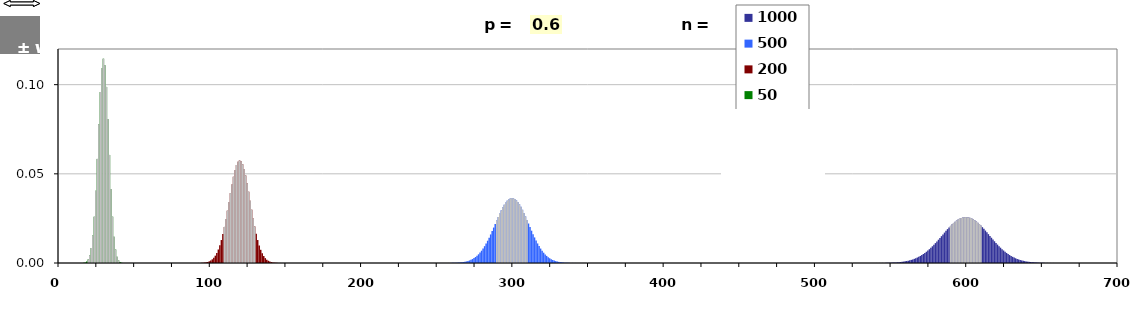
| Category | 1000 | 500 | 200 | 50 |
|---|---|---|---|---|
| 0.0 | -1 | -1 | -1 | -1 |
| 1.0 | -1 | -1 | -1 | -1 |
| 2.0 | -1 | -1 | -1 | -1 |
| 3.0 | -1 | -1 | -1 | -1 |
| 4.0 | -1 | -1 | -1 | -1 |
| 5.0 | -1 | -1 | -1 | -1 |
| 6.0 | -1 | -1 | -1 | -1 |
| 7.0 | -1 | -1 | -1 | -1 |
| 8.0 | -1 | -1 | -1 | -1 |
| 9.0 | -1 | -1 | -1 | -1 |
| 10.0 | -1 | -1 | -1 | -1 |
| 11.0 | -1 | -1 | -1 | -1 |
| 12.0 | -1 | -1 | -1 | -1 |
| 13.0 | -1 | -1 | -1 | -1 |
| 14.0 | -1 | -1 | -1 | -1 |
| 15.0 | -1 | -1 | -1 | -1 |
| 16.0 | -1 | -1 | -1 | -1 |
| 17.0 | -1 | -1 | -1 | -1 |
| 18.0 | -1 | -1 | -1 | -1 |
| 19.0 | -1 | -1 | -1 | -1 |
| 20.0 | -1 | -1 | -1 | 0.002 |
| 21.0 | -1 | -1 | -1 | 0.004 |
| 22.0 | -1 | -1 | -1 | 0.008 |
| 23.0 | -1 | -1 | -1 | 0.015 |
| 24.0 | -1 | -1 | -1 | 0.026 |
| 25.0 | -1 | -1 | -1 | 0.04 |
| 26.0 | -1 | -1 | -1 | 0.058 |
| 27.0 | -1 | -1 | -1 | 0.078 |
| 28.0 | -1 | -1 | -1 | 0.096 |
| 29.0 | -1 | -1 | -1 | 0.109 |
| 30.0 | -1 | -1 | -1 | 0.115 |
| 31.0 | -1 | -1 | -1 | 0.111 |
| 32.0 | -1 | -1 | -1 | 0.099 |
| 33.0 | -1 | -1 | -1 | 0.081 |
| 34.0 | -1 | -1 | -1 | 0.061 |
| 35.0 | -1 | -1 | -1 | 0.042 |
| 36.0 | -1 | -1 | -1 | 0.026 |
| 37.0 | -1 | -1 | -1 | 0.015 |
| 38.0 | -1 | -1 | -1 | 0.008 |
| 39.0 | -1 | -1 | -1 | 0.003 |
| 40.0 | -1 | -1 | -1 | 0.001 |
| 41.0 | -1 | -1 | -1 | -1 |
| 42.0 | -1 | -1 | -1 | -1 |
| 43.0 | -1 | -1 | -1 | -1 |
| 44.0 | -1 | -1 | -1 | -1 |
| 45.0 | -1 | -1 | -1 | -1 |
| 46.0 | -1 | -1 | -1 | -1 |
| 47.0 | -1 | -1 | -1 | -1 |
| 48.0 | -1 | -1 | -1 | -1 |
| 49.0 | -1 | -1 | -1 | -1 |
| 50.0 | -1 | -1 | -1 | -1 |
| 51.0 | -1 | -1 | -1 | -1 |
| 52.0 | -1 | -1 | -1 | -1 |
| 53.0 | -1 | -1 | -1 | -1 |
| 54.0 | -1 | -1 | -1 | -1 |
| 55.0 | -1 | -1 | -1 | -1 |
| 56.0 | -1 | -1 | -1 | -1 |
| 57.0 | -1 | -1 | -1 | -1 |
| 58.0 | -1 | -1 | -1 | -1 |
| 59.0 | -1 | -1 | -1 | -1 |
| 60.0 | -1 | -1 | -1 | -1 |
| 61.0 | -1 | -1 | -1 | -1 |
| 62.0 | -1 | -1 | -1 | -1 |
| 63.0 | -1 | -1 | -1 | -1 |
| 64.0 | -1 | -1 | -1 | -1 |
| 65.0 | -1 | -1 | -1 | -1 |
| 66.0 | -1 | -1 | -1 | -1 |
| 67.0 | -1 | -1 | -1 | -1 |
| 68.0 | -1 | -1 | -1 | -1 |
| 69.0 | -1 | -1 | -1 | -1 |
| 70.0 | -1 | -1 | -1 | -1 |
| 71.0 | -1 | -1 | -1 | -1 |
| 72.0 | -1 | -1 | -1 | -1 |
| 73.0 | -1 | -1 | -1 | -1 |
| 74.0 | -1 | -1 | -1 | -1 |
| 75.0 | -1 | -1 | -1 | -1 |
| 76.0 | -1 | -1 | -1 | -1 |
| 77.0 | -1 | -1 | -1 | -1 |
| 78.0 | -1 | -1 | -1 | -1 |
| 79.0 | -1 | -1 | -1 | -1 |
| 80.0 | -1 | -1 | -1 | -1 |
| 81.0 | -1 | -1 | -1 | -1 |
| 82.0 | -1 | -1 | -1 | -1 |
| 83.0 | -1 | -1 | -1 | -1 |
| 84.0 | -1 | -1 | -1 | -1 |
| 85.0 | -1 | -1 | -1 | -1 |
| 86.0 | -1 | -1 | -1 | -1 |
| 87.0 | -1 | -1 | -1 | -1 |
| 88.0 | -1 | -1 | -1 | -1 |
| 89.0 | -1 | -1 | -1 | -1 |
| 90.0 | -1 | -1 | -1 | -1 |
| 91.0 | -1 | -1 | -1 | -1 |
| 92.0 | -1 | -1 | -1 | -1 |
| 93.0 | -1 | -1 | -1 | -1 |
| 94.0 | -1 | -1 | -1 | -1 |
| 95.0 | -1 | -1 | -1 | -1 |
| 96.0 | -1 | -1 | -1 | -1 |
| 97.0 | -1 | -1 | -1 | -1 |
| 98.0 | -1 | -1 | -1 | -1 |
| 99.0 | -1 | -1 | -1 | -1 |
| 100.0 | -1 | -1 | -1 | -1 |
| 101.0 | -1 | -1 | -1 | -1 |
| 102.0 | -1 | -1 | -1 | -1 |
| 103.0 | -1 | -1 | -1 | -1 |
| 104.0 | -1 | -1 | -1 | -1 |
| 105.0 | -1 | -1 | -1 | -1 |
| 106.0 | -1 | -1 | -1 | -1 |
| 107.0 | -1 | -1 | -1 | -1 |
| 108.0 | -1 | -1 | -1 | -1 |
| 109.0 | -1 | -1 | -1 | -1 |
| 110.0 | -1 | -1 | 0.02 | -1 |
| 111.0 | -1 | -1 | 0.025 | -1 |
| 112.0 | -1 | -1 | 0.029 | -1 |
| 113.0 | -1 | -1 | 0.034 | -1 |
| 114.0 | -1 | -1 | 0.039 | -1 |
| 115.0 | -1 | -1 | 0.044 | -1 |
| 116.0 | -1 | -1 | 0.048 | -1 |
| 117.0 | -1 | -1 | 0.052 | -1 |
| 118.0 | -1 | -1 | 0.055 | -1 |
| 119.0 | -1 | -1 | 0.057 | -1 |
| 120.0 | -1 | -1 | 0.058 | -1 |
| 121.0 | -1 | -1 | 0.057 | -1 |
| 122.0 | -1 | -1 | 0.055 | -1 |
| 123.0 | -1 | -1 | 0.053 | -1 |
| 124.0 | -1 | -1 | 0.049 | -1 |
| 125.0 | -1 | -1 | 0.045 | -1 |
| 126.0 | -1 | -1 | 0.04 | -1 |
| 127.0 | -1 | -1 | 0.035 | -1 |
| 128.0 | -1 | -1 | 0.03 | -1 |
| 129.0 | -1 | -1 | 0.025 | -1 |
| 130.0 | -1 | -1 | 0.02 | -1 |
| 131.0 | -1 | -1 | -1 | -1 |
| 132.0 | -1 | -1 | -1 | -1 |
| 133.0 | -1 | -1 | -1 | -1 |
| 134.0 | -1 | -1 | -1 | -1 |
| 135.0 | -1 | -1 | -1 | -1 |
| 136.0 | -1 | -1 | -1 | -1 |
| 137.0 | -1 | -1 | -1 | -1 |
| 138.0 | -1 | -1 | -1 | -1 |
| 139.0 | -1 | -1 | -1 | -1 |
| 140.0 | -1 | -1 | -1 | -1 |
| 141.0 | -1 | -1 | -1 | -1 |
| 142.0 | -1 | -1 | -1 | -1 |
| 143.0 | -1 | -1 | -1 | -1 |
| 144.0 | -1 | -1 | -1 | -1 |
| 145.0 | -1 | -1 | -1 | -1 |
| 146.0 | -1 | -1 | -1 | -1 |
| 147.0 | -1 | -1 | -1 | -1 |
| 148.0 | -1 | -1 | -1 | -1 |
| 149.0 | -1 | -1 | -1 | -1 |
| 150.0 | -1 | -1 | -1 | -1 |
| 151.0 | -1 | -1 | -1 | -1 |
| 152.0 | -1 | -1 | -1 | -1 |
| 153.0 | -1 | -1 | -1 | -1 |
| 154.0 | -1 | -1 | -1 | -1 |
| 155.0 | -1 | -1 | -1 | -1 |
| 156.0 | -1 | -1 | -1 | -1 |
| 157.0 | -1 | -1 | -1 | -1 |
| 158.0 | -1 | -1 | -1 | -1 |
| 159.0 | -1 | -1 | -1 | -1 |
| 160.0 | -1 | -1 | -1 | -1 |
| 161.0 | -1 | -1 | -1 | -1 |
| 162.0 | -1 | -1 | -1 | -1 |
| 163.0 | -1 | -1 | -1 | -1 |
| 164.0 | -1 | -1 | -1 | -1 |
| 165.0 | -1 | -1 | -1 | -1 |
| 166.0 | -1 | -1 | -1 | -1 |
| 167.0 | -1 | -1 | -1 | -1 |
| 168.0 | -1 | -1 | -1 | -1 |
| 169.0 | -1 | -1 | -1 | -1 |
| 170.0 | -1 | -1 | -1 | -1 |
| 171.0 | -1 | -1 | -1 | -1 |
| 172.0 | -1 | -1 | -1 | -1 |
| 173.0 | -1 | -1 | -1 | -1 |
| 174.0 | -1 | -1 | -1 | -1 |
| 175.0 | -1 | -1 | -1 | -1 |
| 176.0 | -1 | -1 | -1 | -1 |
| 177.0 | -1 | -1 | -1 | -1 |
| 178.0 | -1 | -1 | -1 | -1 |
| 179.0 | -1 | -1 | -1 | -1 |
| 180.0 | -1 | -1 | -1 | -1 |
| 181.0 | -1 | -1 | -1 | -1 |
| 182.0 | -1 | -1 | -1 | -1 |
| 183.0 | -1 | -1 | -1 | -1 |
| 184.0 | -1 | -1 | -1 | -1 |
| 185.0 | -1 | -1 | -1 | -1 |
| 186.0 | -1 | -1 | -1 | -1 |
| 187.0 | -1 | -1 | -1 | -1 |
| 188.0 | -1 | -1 | -1 | -1 |
| 189.0 | -1 | -1 | -1 | -1 |
| 190.0 | -1 | -1 | -1 | -1 |
| 191.0 | -1 | -1 | -1 | -1 |
| 192.0 | -1 | -1 | -1 | -1 |
| 193.0 | -1 | -1 | -1 | -1 |
| 194.0 | -1 | -1 | -1 | -1 |
| 195.0 | -1 | -1 | -1 | -1 |
| 196.0 | -1 | -1 | -1 | -1 |
| 197.0 | -1 | -1 | -1 | -1 |
| 198.0 | -1 | -1 | -1 | -1 |
| 199.0 | -1 | -1 | -1 | -1 |
| 200.0 | -1 | -1 | -1 | -1 |
| 201.0 | -1 | -1 | -1 | -1 |
| 202.0 | -1 | -1 | -1 | -1 |
| 203.0 | -1 | -1 | -1 | -1 |
| 204.0 | -1 | -1 | -1 | -1 |
| 205.0 | -1 | -1 | -1 | -1 |
| 206.0 | -1 | -1 | -1 | -1 |
| 207.0 | -1 | -1 | -1 | -1 |
| 208.0 | -1 | -1 | -1 | -1 |
| 209.0 | -1 | -1 | -1 | -1 |
| 210.0 | -1 | -1 | -1 | -1 |
| 211.0 | -1 | -1 | -1 | -1 |
| 212.0 | -1 | -1 | -1 | -1 |
| 213.0 | -1 | -1 | -1 | -1 |
| 214.0 | -1 | -1 | -1 | -1 |
| 215.0 | -1 | -1 | -1 | -1 |
| 216.0 | -1 | -1 | -1 | -1 |
| 217.0 | -1 | -1 | -1 | -1 |
| 218.0 | -1 | -1 | -1 | -1 |
| 219.0 | -1 | -1 | -1 | -1 |
| 220.0 | -1 | -1 | -1 | -1 |
| 221.0 | -1 | -1 | -1 | -1 |
| 222.0 | -1 | -1 | -1 | -1 |
| 223.0 | -1 | -1 | -1 | -1 |
| 224.0 | -1 | -1 | -1 | -1 |
| 225.0 | -1 | -1 | -1 | -1 |
| 226.0 | -1 | -1 | -1 | -1 |
| 227.0 | -1 | -1 | -1 | -1 |
| 228.0 | -1 | -1 | -1 | -1 |
| 229.0 | -1 | -1 | -1 | -1 |
| 230.0 | -1 | -1 | -1 | -1 |
| 231.0 | -1 | -1 | -1 | -1 |
| 232.0 | -1 | -1 | -1 | -1 |
| 233.0 | -1 | -1 | -1 | -1 |
| 234.0 | -1 | -1 | -1 | -1 |
| 235.0 | -1 | -1 | -1 | -1 |
| 236.0 | -1 | -1 | -1 | -1 |
| 237.0 | -1 | -1 | -1 | -1 |
| 238.0 | -1 | -1 | -1 | -1 |
| 239.0 | -1 | -1 | -1 | -1 |
| 240.0 | -1 | -1 | -1 | -1 |
| 241.0 | -1 | -1 | -1 | -1 |
| 242.0 | -1 | -1 | -1 | -1 |
| 243.0 | -1 | -1 | -1 | -1 |
| 244.0 | -1 | -1 | -1 | -1 |
| 245.0 | -1 | -1 | -1 | -1 |
| 246.0 | -1 | -1 | -1 | -1 |
| 247.0 | -1 | -1 | -1 | -1 |
| 248.0 | -1 | -1 | -1 | -1 |
| 249.0 | -1 | -1 | -1 | -1 |
| 250.0 | -1 | -1 | -1 | -1 |
| 251.0 | -1 | -1 | -1 | -1 |
| 252.0 | -1 | -1 | -1 | -1 |
| 253.0 | -1 | -1 | -1 | -1 |
| 254.0 | -1 | -1 | -1 | -1 |
| 255.0 | -1 | -1 | -1 | -1 |
| 256.0 | -1 | -1 | -1 | -1 |
| 257.0 | -1 | -1 | -1 | -1 |
| 258.0 | -1 | -1 | -1 | -1 |
| 259.0 | -1 | -1 | -1 | -1 |
| 260.0 | -1 | -1 | -1 | -1 |
| 261.0 | -1 | -1 | -1 | -1 |
| 262.0 | -1 | -1 | -1 | -1 |
| 263.0 | -1 | -1 | -1 | -1 |
| 264.0 | -1 | -1 | -1 | -1 |
| 265.0 | -1 | -1 | -1 | -1 |
| 266.0 | -1 | -1 | -1 | -1 |
| 267.0 | -1 | -1 | -1 | -1 |
| 268.0 | -1 | -1 | -1 | -1 |
| 269.0 | -1 | -1 | -1 | -1 |
| 270.0 | -1 | -1 | -1 | -1 |
| 271.0 | -1 | -1 | -1 | -1 |
| 272.0 | -1 | -1 | -1 | -1 |
| 273.0 | -1 | -1 | -1 | -1 |
| 274.0 | -1 | -1 | -1 | -1 |
| 275.0 | -1 | -1 | -1 | -1 |
| 276.0 | -1 | -1 | -1 | -1 |
| 277.0 | -1 | -1 | -1 | -1 |
| 278.0 | -1 | -1 | -1 | -1 |
| 279.0 | -1 | -1 | -1 | -1 |
| 280.0 | -1 | -1 | -1 | -1 |
| 281.0 | -1 | -1 | -1 | -1 |
| 282.0 | -1 | -1 | -1 | -1 |
| 283.0 | -1 | -1 | -1 | -1 |
| 284.0 | -1 | -1 | -1 | -1 |
| 285.0 | -1 | -1 | -1 | -1 |
| 286.0 | -1 | -1 | -1 | -1 |
| 287.0 | -1 | -1 | -1 | -1 |
| 288.0 | -1 | -1 | -1 | -1 |
| 289.0 | -1 | -1 | -1 | -1 |
| 290.0 | -1 | 0.024 | -1 | -1 |
| 291.0 | -1 | 0.026 | -1 | -1 |
| 292.0 | -1 | 0.028 | -1 | -1 |
| 293.0 | -1 | 0.03 | -1 | -1 |
| 294.0 | -1 | 0.031 | -1 | -1 |
| 295.0 | -1 | 0.033 | -1 | -1 |
| 296.0 | -1 | 0.034 | -1 | -1 |
| 297.0 | -1 | 0.035 | -1 | -1 |
| 298.0 | -1 | 0.036 | -1 | -1 |
| 299.0 | -1 | 0.036 | -1 | -1 |
| 300.0 | -1 | 0.036 | -1 | -1 |
| 301.0 | -1 | 0.036 | -1 | -1 |
| 302.0 | -1 | 0.036 | -1 | -1 |
| 303.0 | -1 | 0.035 | -1 | -1 |
| 304.0 | -1 | 0.034 | -1 | -1 |
| 305.0 | -1 | 0.033 | -1 | -1 |
| 306.0 | -1 | 0.031 | -1 | -1 |
| 307.0 | -1 | 0.03 | -1 | -1 |
| 308.0 | -1 | 0.028 | -1 | -1 |
| 309.0 | -1 | 0.026 | -1 | -1 |
| 310.0 | -1 | 0.024 | -1 | -1 |
| 311.0 | -1 | -1 | -1 | -1 |
| 312.0 | -1 | -1 | -1 | -1 |
| 313.0 | -1 | -1 | -1 | -1 |
| 314.0 | -1 | -1 | -1 | -1 |
| 315.0 | -1 | -1 | -1 | -1 |
| 316.0 | -1 | -1 | -1 | -1 |
| 317.0 | -1 | -1 | -1 | -1 |
| 318.0 | -1 | -1 | -1 | -1 |
| 319.0 | -1 | -1 | -1 | -1 |
| 320.0 | -1 | -1 | -1 | -1 |
| 321.0 | -1 | -1 | -1 | -1 |
| 322.0 | -1 | -1 | -1 | -1 |
| 323.0 | -1 | -1 | -1 | -1 |
| 324.0 | -1 | -1 | -1 | -1 |
| 325.0 | -1 | -1 | -1 | -1 |
| 326.0 | -1 | -1 | -1 | -1 |
| 327.0 | -1 | -1 | -1 | -1 |
| 328.0 | -1 | -1 | -1 | -1 |
| 329.0 | -1 | -1 | -1 | -1 |
| 330.0 | -1 | -1 | -1 | -1 |
| 331.0 | -1 | -1 | -1 | -1 |
| 332.0 | -1 | -1 | -1 | -1 |
| 333.0 | -1 | -1 | -1 | -1 |
| 334.0 | -1 | -1 | -1 | -1 |
| 335.0 | -1 | -1 | -1 | -1 |
| 336.0 | -1 | -1 | -1 | -1 |
| 337.0 | -1 | -1 | -1 | -1 |
| 338.0 | -1 | -1 | -1 | -1 |
| 339.0 | -1 | -1 | -1 | -1 |
| 340.0 | -1 | -1 | -1 | -1 |
| 341.0 | -1 | -1 | -1 | -1 |
| 342.0 | -1 | -1 | -1 | -1 |
| 343.0 | -1 | -1 | -1 | -1 |
| 344.0 | -1 | -1 | -1 | -1 |
| 345.0 | -1 | -1 | -1 | -1 |
| 346.0 | -1 | -1 | -1 | -1 |
| 347.0 | -1 | -1 | -1 | -1 |
| 348.0 | -1 | -1 | -1 | -1 |
| 349.0 | -1 | -1 | -1 | -1 |
| 350.0 | -1 | -1 | -1 | -1 |
| 351.0 | -1 | -1 | -1 | -1 |
| 352.0 | -1 | -1 | -1 | -1 |
| 353.0 | -1 | -1 | -1 | -1 |
| 354.0 | -1 | -1 | -1 | -1 |
| 355.0 | -1 | -1 | -1 | -1 |
| 356.0 | -1 | -1 | -1 | -1 |
| 357.0 | -1 | -1 | -1 | -1 |
| 358.0 | -1 | -1 | -1 | -1 |
| 359.0 | -1 | -1 | -1 | -1 |
| 360.0 | -1 | -1 | -1 | -1 |
| 361.0 | -1 | -1 | -1 | -1 |
| 362.0 | -1 | -1 | -1 | -1 |
| 363.0 | -1 | -1 | -1 | -1 |
| 364.0 | -1 | -1 | -1 | -1 |
| 365.0 | -1 | -1 | -1 | -1 |
| 366.0 | -1 | -1 | -1 | -1 |
| 367.0 | -1 | -1 | -1 | -1 |
| 368.0 | -1 | -1 | -1 | -1 |
| 369.0 | -1 | -1 | -1 | -1 |
| 370.0 | -1 | -1 | -1 | -1 |
| 371.0 | -1 | -1 | -1 | -1 |
| 372.0 | -1 | -1 | -1 | -1 |
| 373.0 | -1 | -1 | -1 | -1 |
| 374.0 | -1 | -1 | -1 | -1 |
| 375.0 | -1 | -1 | -1 | -1 |
| 376.0 | -1 | -1 | -1 | -1 |
| 377.0 | -1 | -1 | -1 | -1 |
| 378.0 | -1 | -1 | -1 | -1 |
| 379.0 | -1 | -1 | -1 | -1 |
| 380.0 | -1 | -1 | -1 | -1 |
| 381.0 | -1 | -1 | -1 | -1 |
| 382.0 | -1 | -1 | -1 | -1 |
| 383.0 | -1 | -1 | -1 | -1 |
| 384.0 | -1 | -1 | -1 | -1 |
| 385.0 | -1 | -1 | -1 | -1 |
| 386.0 | -1 | -1 | -1 | -1 |
| 387.0 | -1 | -1 | -1 | -1 |
| 388.0 | -1 | -1 | -1 | -1 |
| 389.0 | -1 | -1 | -1 | -1 |
| 390.0 | -1 | -1 | -1 | -1 |
| 391.0 | -1 | -1 | -1 | -1 |
| 392.0 | -1 | -1 | -1 | -1 |
| 393.0 | -1 | -1 | -1 | -1 |
| 394.0 | -1 | -1 | -1 | -1 |
| 395.0 | -1 | -1 | -1 | -1 |
| 396.0 | -1 | -1 | -1 | -1 |
| 397.0 | -1 | -1 | -1 | -1 |
| 398.0 | -1 | -1 | -1 | -1 |
| 399.0 | -1 | -1 | -1 | -1 |
| 400.0 | -1 | -1 | -1 | -1 |
| 401.0 | -1 | -1 | -1 | -1 |
| 402.0 | -1 | -1 | -1 | -1 |
| 403.0 | -1 | -1 | -1 | -1 |
| 404.0 | -1 | -1 | -1 | -1 |
| 405.0 | -1 | -1 | -1 | -1 |
| 406.0 | -1 | -1 | -1 | -1 |
| 407.0 | -1 | -1 | -1 | -1 |
| 408.0 | -1 | -1 | -1 | -1 |
| 409.0 | -1 | -1 | -1 | -1 |
| 410.0 | -1 | -1 | -1 | -1 |
| 411.0 | -1 | -1 | -1 | -1 |
| 412.0 | -1 | -1 | -1 | -1 |
| 413.0 | -1 | -1 | -1 | -1 |
| 414.0 | -1 | -1 | -1 | -1 |
| 415.0 | -1 | -1 | -1 | -1 |
| 416.0 | -1 | -1 | -1 | -1 |
| 417.0 | -1 | -1 | -1 | -1 |
| 418.0 | -1 | -1 | -1 | -1 |
| 419.0 | -1 | -1 | -1 | -1 |
| 420.0 | -1 | -1 | -1 | -1 |
| 421.0 | -1 | -1 | -1 | -1 |
| 422.0 | -1 | -1 | -1 | -1 |
| 423.0 | -1 | -1 | -1 | -1 |
| 424.0 | -1 | -1 | -1 | -1 |
| 425.0 | -1 | -1 | -1 | -1 |
| 426.0 | -1 | -1 | -1 | -1 |
| 427.0 | -1 | -1 | -1 | -1 |
| 428.0 | -1 | -1 | -1 | -1 |
| 429.0 | -1 | -1 | -1 | -1 |
| 430.0 | -1 | -1 | -1 | -1 |
| 431.0 | -1 | -1 | -1 | -1 |
| 432.0 | -1 | -1 | -1 | -1 |
| 433.0 | -1 | -1 | -1 | -1 |
| 434.0 | -1 | -1 | -1 | -1 |
| 435.0 | -1 | -1 | -1 | -1 |
| 436.0 | -1 | -1 | -1 | -1 |
| 437.0 | -1 | -1 | -1 | -1 |
| 438.0 | -1 | -1 | -1 | -1 |
| 439.0 | -1 | -1 | -1 | -1 |
| 440.0 | -1 | -1 | -1 | -1 |
| 441.0 | -1 | -1 | -1 | -1 |
| 442.0 | -1 | -1 | -1 | -1 |
| 443.0 | -1 | -1 | -1 | -1 |
| 444.0 | -1 | -1 | -1 | -1 |
| 445.0 | -1 | -1 | -1 | -1 |
| 446.0 | -1 | -1 | -1 | -1 |
| 447.0 | -1 | -1 | -1 | -1 |
| 448.0 | -1 | -1 | -1 | -1 |
| 449.0 | -1 | -1 | -1 | -1 |
| 450.0 | -1 | -1 | -1 | -1 |
| 451.0 | -1 | -1 | -1 | -1 |
| 452.0 | -1 | -1 | -1 | -1 |
| 453.0 | -1 | -1 | -1 | -1 |
| 454.0 | -1 | -1 | -1 | -1 |
| 455.0 | -1 | -1 | -1 | -1 |
| 456.0 | -1 | -1 | -1 | -1 |
| 457.0 | -1 | -1 | -1 | -1 |
| 458.0 | -1 | -1 | -1 | -1 |
| 459.0 | -1 | -1 | -1 | -1 |
| 460.0 | -1 | -1 | -1 | -1 |
| 461.0 | -1 | -1 | -1 | -1 |
| 462.0 | -1 | -1 | -1 | -1 |
| 463.0 | -1 | -1 | -1 | -1 |
| 464.0 | -1 | -1 | -1 | -1 |
| 465.0 | -1 | -1 | -1 | -1 |
| 466.0 | -1 | -1 | -1 | -1 |
| 467.0 | -1 | -1 | -1 | -1 |
| 468.0 | -1 | -1 | -1 | -1 |
| 469.0 | -1 | -1 | -1 | -1 |
| 470.0 | -1 | -1 | -1 | -1 |
| 471.0 | -1 | -1 | -1 | -1 |
| 472.0 | -1 | -1 | -1 | -1 |
| 473.0 | -1 | -1 | -1 | -1 |
| 474.0 | -1 | -1 | -1 | -1 |
| 475.0 | -1 | -1 | -1 | -1 |
| 476.0 | -1 | -1 | -1 | -1 |
| 477.0 | -1 | -1 | -1 | -1 |
| 478.0 | -1 | -1 | -1 | -1 |
| 479.0 | -1 | -1 | -1 | -1 |
| 480.0 | -1 | -1 | -1 | -1 |
| 481.0 | -1 | -1 | -1 | -1 |
| 482.0 | -1 | -1 | -1 | -1 |
| 483.0 | -1 | -1 | -1 | -1 |
| 484.0 | -1 | -1 | -1 | -1 |
| 485.0 | -1 | -1 | -1 | -1 |
| 486.0 | -1 | -1 | -1 | -1 |
| 487.0 | -1 | -1 | -1 | -1 |
| 488.0 | -1 | -1 | -1 | -1 |
| 489.0 | -1 | -1 | -1 | -1 |
| 490.0 | -1 | -1 | -1 | -1 |
| 491.0 | -1 | -1 | -1 | -1 |
| 492.0 | -1 | -1 | -1 | -1 |
| 493.0 | -1 | -1 | -1 | -1 |
| 494.0 | -1 | -1 | -1 | -1 |
| 495.0 | -1 | -1 | -1 | -1 |
| 496.0 | -1 | -1 | -1 | -1 |
| 497.0 | -1 | -1 | -1 | -1 |
| 498.0 | -1 | -1 | -1 | -1 |
| 499.0 | -1 | -1 | -1 | -1 |
| 500.0 | -1 | -1 | -1 | -1 |
| 501.0 | -1 | -1 | -1 | -1 |
| 502.0 | -1 | -1 | -1 | -1 |
| 503.0 | -1 | -1 | -1 | -1 |
| 504.0 | -1 | -1 | -1 | -1 |
| 505.0 | -1 | -1 | -1 | -1 |
| 506.0 | -1 | -1 | -1 | -1 |
| 507.0 | -1 | -1 | -1 | -1 |
| 508.0 | -1 | -1 | -1 | -1 |
| 509.0 | -1 | -1 | -1 | -1 |
| 510.0 | -1 | -1 | -1 | -1 |
| 511.0 | -1 | -1 | -1 | -1 |
| 512.0 | -1 | -1 | -1 | -1 |
| 513.0 | -1 | -1 | -1 | -1 |
| 514.0 | -1 | -1 | -1 | -1 |
| 515.0 | -1 | -1 | -1 | -1 |
| 516.0 | -1 | -1 | -1 | -1 |
| 517.0 | -1 | -1 | -1 | -1 |
| 518.0 | -1 | -1 | -1 | -1 |
| 519.0 | -1 | -1 | -1 | -1 |
| 520.0 | -1 | -1 | -1 | -1 |
| 521.0 | -1 | -1 | -1 | -1 |
| 522.0 | -1 | -1 | -1 | -1 |
| 523.0 | -1 | -1 | -1 | -1 |
| 524.0 | -1 | -1 | -1 | -1 |
| 525.0 | -1 | -1 | -1 | -1 |
| 526.0 | -1 | -1 | -1 | -1 |
| 527.0 | -1 | -1 | -1 | -1 |
| 528.0 | -1 | -1 | -1 | -1 |
| 529.0 | -1 | -1 | -1 | -1 |
| 530.0 | -1 | -1 | -1 | -1 |
| 531.0 | -1 | -1 | -1 | -1 |
| 532.0 | -1 | -1 | -1 | -1 |
| 533.0 | -1 | -1 | -1 | -1 |
| 534.0 | -1 | -1 | -1 | -1 |
| 535.0 | -1 | -1 | -1 | -1 |
| 536.0 | -1 | -1 | -1 | -1 |
| 537.0 | -1 | -1 | -1 | -1 |
| 538.0 | -1 | -1 | -1 | -1 |
| 539.0 | -1 | -1 | -1 | -1 |
| 540.0 | -1 | -1 | -1 | -1 |
| 541.0 | -1 | -1 | -1 | -1 |
| 542.0 | -1 | -1 | -1 | -1 |
| 543.0 | -1 | -1 | -1 | -1 |
| 544.0 | -1 | -1 | -1 | -1 |
| 545.0 | -1 | -1 | -1 | -1 |
| 546.0 | -1 | -1 | -1 | -1 |
| 547.0 | -1 | -1 | -1 | -1 |
| 548.0 | -1 | -1 | -1 | -1 |
| 549.0 | -1 | -1 | -1 | -1 |
| 550.0 | -1 | -1 | -1 | -1 |
| 551.0 | -1 | -1 | -1 | -1 |
| 552.0 | -1 | -1 | -1 | -1 |
| 553.0 | -1 | -1 | -1 | -1 |
| 554.0 | -1 | -1 | -1 | -1 |
| 555.0 | -1 | -1 | -1 | -1 |
| 556.0 | -1 | -1 | -1 | -1 |
| 557.0 | -1 | -1 | -1 | -1 |
| 558.0 | -1 | -1 | -1 | -1 |
| 559.0 | -1 | -1 | -1 | -1 |
| 560.0 | -1 | -1 | -1 | -1 |
| 561.0 | -1 | -1 | -1 | -1 |
| 562.0 | -1 | -1 | -1 | -1 |
| 563.0 | -1 | -1 | -1 | -1 |
| 564.0 | -1 | -1 | -1 | -1 |
| 565.0 | -1 | -1 | -1 | -1 |
| 566.0 | -1 | -1 | -1 | -1 |
| 567.0 | -1 | -1 | -1 | -1 |
| 568.0 | -1 | -1 | -1 | -1 |
| 569.0 | -1 | -1 | -1 | -1 |
| 570.0 | -1 | -1 | -1 | -1 |
| 571.0 | -1 | -1 | -1 | -1 |
| 572.0 | -1 | -1 | -1 | -1 |
| 573.0 | -1 | -1 | -1 | -1 |
| 574.0 | -1 | -1 | -1 | -1 |
| 575.0 | -1 | -1 | -1 | -1 |
| 576.0 | -1 | -1 | -1 | -1 |
| 577.0 | -1 | -1 | -1 | -1 |
| 578.0 | -1 | -1 | -1 | -1 |
| 579.0 | -1 | -1 | -1 | -1 |
| 580.0 | -1 | -1 | -1 | -1 |
| 581.0 | -1 | -1 | -1 | -1 |
| 582.0 | -1 | -1 | -1 | -1 |
| 583.0 | -1 | -1 | -1 | -1 |
| 584.0 | -1 | -1 | -1 | -1 |
| 585.0 | -1 | -1 | -1 | -1 |
| 586.0 | -1 | -1 | -1 | -1 |
| 587.0 | -1 | -1 | -1 | -1 |
| 588.0 | -1 | -1 | -1 | -1 |
| 589.0 | -1 | -1 | -1 | -1 |
| 590.0 | 0.021 | -1 | -1 | -1 |
| 591.0 | 0.022 | -1 | -1 | -1 |
| 592.0 | 0.022 | -1 | -1 | -1 |
| 593.0 | 0.023 | -1 | -1 | -1 |
| 594.0 | 0.024 | -1 | -1 | -1 |
| 595.0 | 0.024 | -1 | -1 | -1 |
| 596.0 | 0.025 | -1 | -1 | -1 |
| 597.0 | 0.025 | -1 | -1 | -1 |
| 598.0 | 0.026 | -1 | -1 | -1 |
| 599.0 | 0.026 | -1 | -1 | -1 |
| 600.0 | 0.026 | -1 | -1 | -1 |
| 601.0 | 0.026 | -1 | -1 | -1 |
| 602.0 | 0.026 | -1 | -1 | -1 |
| 603.0 | 0.025 | -1 | -1 | -1 |
| 604.0 | 0.025 | -1 | -1 | -1 |
| 605.0 | 0.024 | -1 | -1 | -1 |
| 606.0 | 0.024 | -1 | -1 | -1 |
| 607.0 | 0.023 | -1 | -1 | -1 |
| 608.0 | 0.023 | -1 | -1 | -1 |
| 609.0 | 0.022 | -1 | -1 | -1 |
| 610.0 | 0.021 | -1 | -1 | -1 |
| 611.0 | -1 | -1 | -1 | -1 |
| 612.0 | -1 | -1 | -1 | -1 |
| 613.0 | -1 | -1 | -1 | -1 |
| 614.0 | -1 | -1 | -1 | -1 |
| 615.0 | -1 | -1 | -1 | -1 |
| 616.0 | -1 | -1 | -1 | -1 |
| 617.0 | -1 | -1 | -1 | -1 |
| 618.0 | -1 | -1 | -1 | -1 |
| 619.0 | -1 | -1 | -1 | -1 |
| 620.0 | -1 | -1 | -1 | -1 |
| 621.0 | -1 | -1 | -1 | -1 |
| 622.0 | -1 | -1 | -1 | -1 |
| 623.0 | -1 | -1 | -1 | -1 |
| 624.0 | -1 | -1 | -1 | -1 |
| 625.0 | -1 | -1 | -1 | -1 |
| 626.0 | -1 | -1 | -1 | -1 |
| 627.0 | -1 | -1 | -1 | -1 |
| 628.0 | -1 | -1 | -1 | -1 |
| 629.0 | -1 | -1 | -1 | -1 |
| 630.0 | -1 | -1 | -1 | -1 |
| 631.0 | -1 | -1 | -1 | -1 |
| 632.0 | -1 | -1 | -1 | -1 |
| 633.0 | -1 | -1 | -1 | -1 |
| 634.0 | -1 | -1 | -1 | -1 |
| 635.0 | -1 | -1 | -1 | -1 |
| 636.0 | -1 | -1 | -1 | -1 |
| 637.0 | -1 | -1 | -1 | -1 |
| 638.0 | -1 | -1 | -1 | -1 |
| 639.0 | -1 | -1 | -1 | -1 |
| 640.0 | -1 | -1 | -1 | -1 |
| 641.0 | -1 | -1 | -1 | -1 |
| 642.0 | -1 | -1 | -1 | -1 |
| 643.0 | -1 | -1 | -1 | -1 |
| 644.0 | -1 | -1 | -1 | -1 |
| 645.0 | -1 | -1 | -1 | -1 |
| 646.0 | -1 | -1 | -1 | -1 |
| 647.0 | -1 | -1 | -1 | -1 |
| 648.0 | -1 | -1 | -1 | -1 |
| 649.0 | -1 | -1 | -1 | -1 |
| 650.0 | -1 | -1 | -1 | -1 |
| 651.0 | -1 | -1 | -1 | -1 |
| 652.0 | -1 | -1 | -1 | -1 |
| 653.0 | -1 | -1 | -1 | -1 |
| 654.0 | -1 | -1 | -1 | -1 |
| 655.0 | -1 | -1 | -1 | -1 |
| 656.0 | -1 | -1 | -1 | -1 |
| 657.0 | -1 | -1 | -1 | -1 |
| 658.0 | -1 | -1 | -1 | -1 |
| 659.0 | -1 | -1 | -1 | -1 |
| 660.0 | -1 | -1 | -1 | -1 |
| 661.0 | -1 | -1 | -1 | -1 |
| 662.0 | -1 | -1 | -1 | -1 |
| 663.0 | -1 | -1 | -1 | -1 |
| 664.0 | -1 | -1 | -1 | -1 |
| 665.0 | -1 | -1 | -1 | -1 |
| 666.0 | -1 | -1 | -1 | -1 |
| 667.0 | -1 | -1 | -1 | -1 |
| 668.0 | -1 | -1 | -1 | -1 |
| 669.0 | -1 | -1 | -1 | -1 |
| 670.0 | -1 | -1 | -1 | -1 |
| 671.0 | -1 | -1 | -1 | -1 |
| 672.0 | -1 | -1 | -1 | -1 |
| 673.0 | -1 | -1 | -1 | -1 |
| 674.0 | -1 | -1 | -1 | -1 |
| 675.0 | -1 | -1 | -1 | -1 |
| 676.0 | -1 | -1 | -1 | -1 |
| 677.0 | -1 | -1 | -1 | -1 |
| 678.0 | -1 | -1 | -1 | -1 |
| 679.0 | -1 | -1 | -1 | -1 |
| 680.0 | -1 | -1 | -1 | -1 |
| 681.0 | -1 | -1 | -1 | -1 |
| 682.0 | -1 | -1 | -1 | -1 |
| 683.0 | -1 | -1 | -1 | -1 |
| 684.0 | -1 | -1 | -1 | -1 |
| 685.0 | -1 | -1 | -1 | -1 |
| 686.0 | -1 | -1 | -1 | -1 |
| 687.0 | -1 | -1 | -1 | -1 |
| 688.0 | -1 | -1 | -1 | -1 |
| 689.0 | -1 | -1 | -1 | -1 |
| 690.0 | -1 | -1 | -1 | -1 |
| 691.0 | -1 | -1 | -1 | -1 |
| 692.0 | -1 | -1 | -1 | -1 |
| 693.0 | -1 | -1 | -1 | -1 |
| 694.0 | -1 | -1 | -1 | -1 |
| 695.0 | -1 | -1 | -1 | -1 |
| 696.0 | -1 | -1 | -1 | -1 |
| 697.0 | -1 | -1 | -1 | -1 |
| 698.0 | -1 | -1 | -1 | -1 |
| 699.0 | -1 | -1 | -1 | -1 |
| 700.0 | -1 | -1 | -1 | -1 |